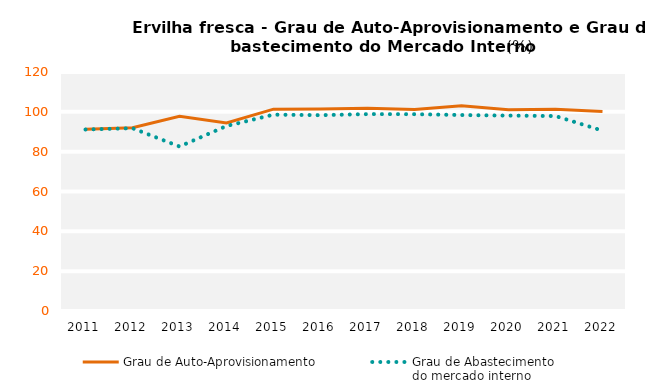
| Category | Grau de Auto-Aprovisionamento | Grau de Abastecimento
do mercado interno |
|---|---|---|
| 2011.0 | 91.273 | 91.126 |
| 2012.0 | 92.044 | 91.778 |
| 2013.0 | 97.816 | 82.586 |
| 2014.0 | 94.405 | 92.879 |
| 2015.0 | 101.338 | 98.585 |
| 2016.0 | 101.363 | 98.327 |
| 2017.0 | 101.859 | 98.861 |
| 2018.0 | 101.211 | 98.826 |
| 2019.0 | 103.05 | 98.392 |
| 2020.0 | 100.987 | 98.116 |
| 2021.0 | 101.292 | 97.883 |
| 2022.0 | 100.155 | 90.547 |